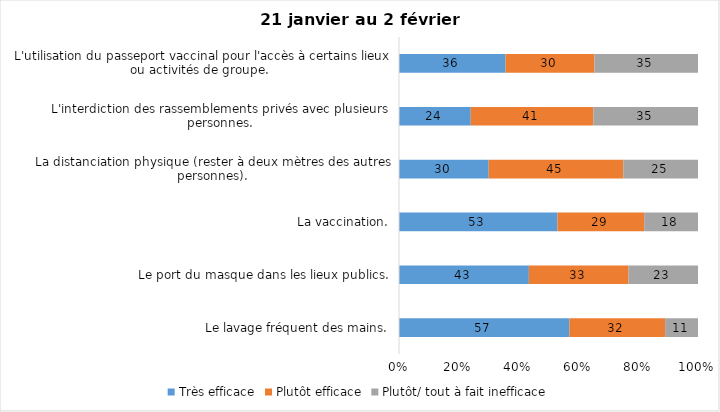
| Category | Très efficace | Plutôt efficace | Plutôt/ tout à fait inefficace |
|---|---|---|---|
| Le lavage fréquent des mains. | 57 | 32 | 11 |
| Le port du masque dans les lieux publics. | 43 | 33 | 23 |
| La vaccination. | 53 | 29 | 18 |
| La distanciation physique (rester à deux mètres des autres personnes). | 30 | 45 | 25 |
| L'interdiction des rassemblements privés avec plusieurs personnes. | 24 | 41 | 35 |
| L'utilisation du passeport vaccinal pour l'accès à certains lieux ou activités de groupe.  | 36 | 30 | 35 |